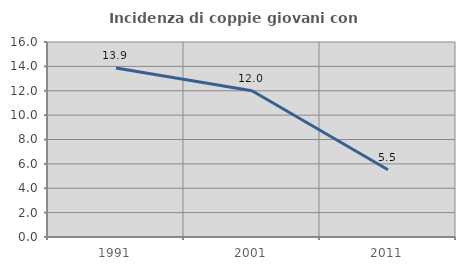
| Category | Incidenza di coppie giovani con figli |
|---|---|
| 1991.0 | 13.869 |
| 2001.0 | 12 |
| 2011.0 | 5.517 |